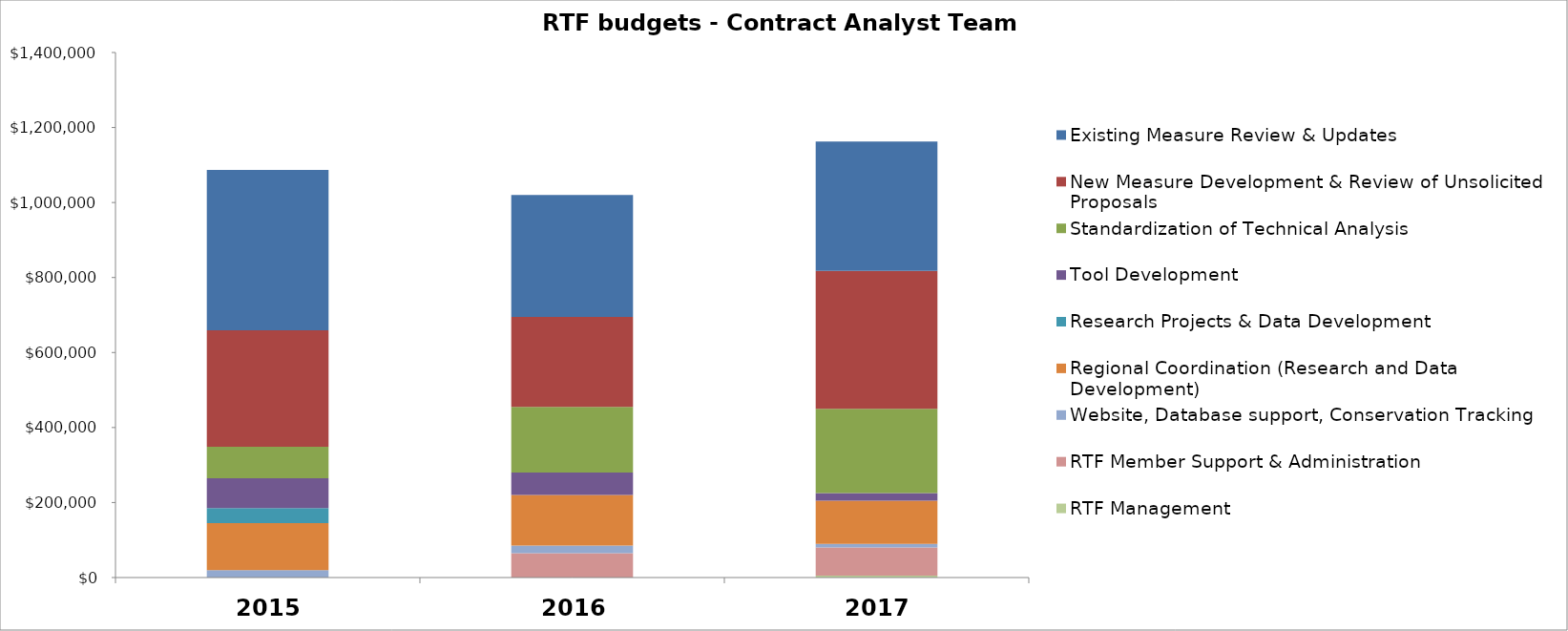
| Category | RTF Management | RTF Member Support & Administration | Website, Database support, Conservation Tracking  | Regional Coordination (Research and Data Development) | Research Projects & Data Development | Tool Development | Standardization of Technical Analysis | New Measure Development & Review of Unsolicited Proposals | Existing Measure Review & Updates |
|---|---|---|---|---|---|---|---|---|---|
| 0 | 0 | 0 | 20000 | 125000 | 40000 | 80000 | 84000 | 310000 | 428000 |
| 1 | 0 | 65000 | 20000 | 135000 | 0 | 60000 | 175000 | 240000 | 325000 |
| 2 | 5000 | 75000 | 10000 | 115000 | 0 | 20000 | 225000 | 367500 | 345000 |